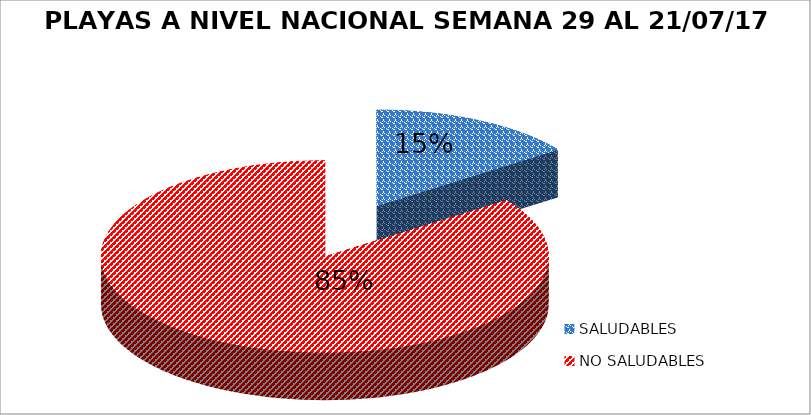
| Category | N.° |
|---|---|
| SALUDABLES | 18 |
| NO SALUDABLES | 102 |